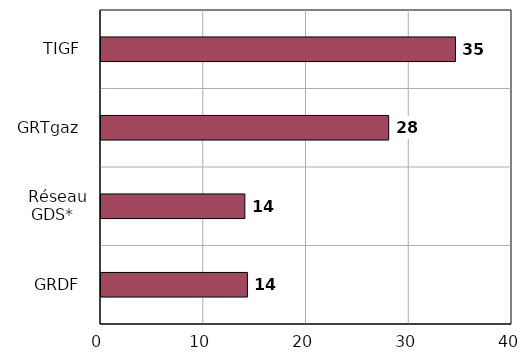
| Category | Capacité moyenne de production par unité |
|---|---|
| GRDF | 14.25 |
| Réseau GDS* | 14 |
| GRTgaz | 28 |
| TIGF | 34.5 |